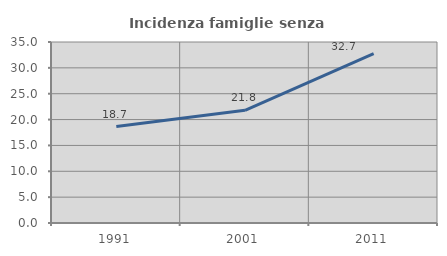
| Category | Incidenza famiglie senza nuclei |
|---|---|
| 1991.0 | 18.652 |
| 2001.0 | 21.794 |
| 2011.0 | 32.74 |